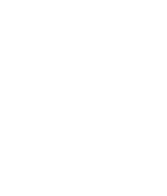
| Category | Series 0 |
|---|---|
| Preparation and prioritisation | 0 |
| Commitment to research | 0 |
| Time management | 0 |
| Responsiveness to change | 0 |
| Work-life balance | 0 |